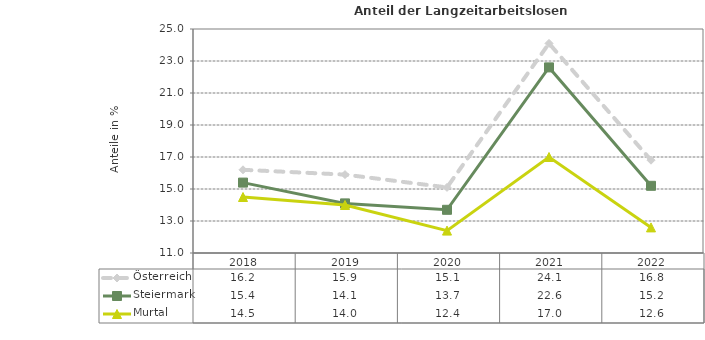
| Category | Österreich | Steiermark | Murtal |
|---|---|---|---|
| 2022.0 | 16.8 | 15.2 | 12.6 |
| 2021.0 | 24.1 | 22.6 | 17 |
| 2020.0 | 15.1 | 13.7 | 12.4 |
| 2019.0 | 15.9 | 14.1 | 14 |
| 2018.0 | 16.2 | 15.4 | 14.5 |